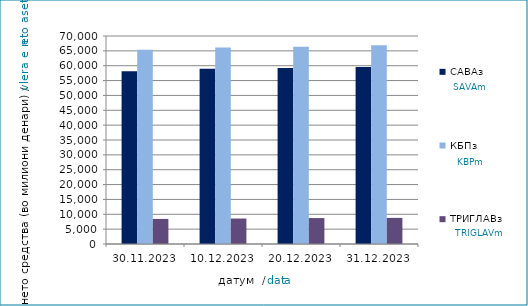
| Category | САВАз | КБПз | ТРИГЛАВз |
|---|---|---|---|
| 2023-11-30 | 58178.479 | 65331.559 | 8439.685 |
| 2023-12-10 | 58995.069 | 66142.275 | 8565.583 |
| 2023-12-20 | 59249.486 | 66393.361 | 8727.892 |
| 2023-12-31 | 59552.475 | 66866.035 | 8788.006 |